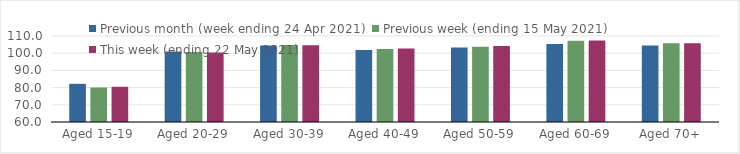
| Category | Previous month (week ending 24 Apr 2021) | Previous week (ending 15 May 2021) | This week (ending 22 May 2021) |
|---|---|---|---|
| Aged 15-19 | 82.19 | 80.07 | 80.49 |
| Aged 20-29 | 101.04 | 100.76 | 100.35 |
| Aged 30-39 | 104.5 | 104.73 | 104.69 |
| Aged 40-49 | 101.91 | 102.4 | 102.74 |
| Aged 50-59 | 103.33 | 103.76 | 104.19 |
| Aged 60-69 | 105.42 | 107.29 | 107.39 |
| Aged 70+ | 104.47 | 105.83 | 105.84 |